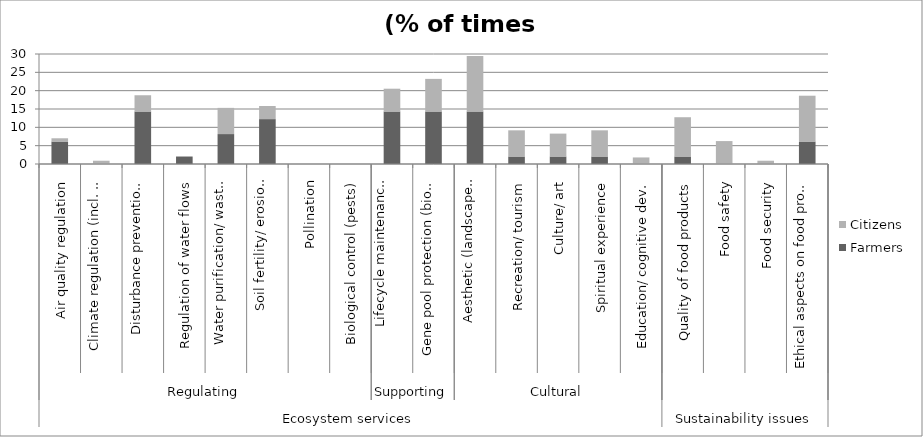
| Category | Farmers | Citizens |
|---|---|---|
| 0 | 6.122 | 0.893 |
| 1 | 0 | 0.893 |
| 2 | 14.286 | 4.464 |
| 3 | 2.041 | 0 |
| 4 | 8.163 | 7.143 |
| 5 | 12.245 | 3.571 |
| 6 | 0 | 0 |
| 7 | 0 | 0 |
| 8 | 14.286 | 6.25 |
| 9 | 14.286 | 8.929 |
| 10 | 14.286 | 15.179 |
| 11 | 2.041 | 7.143 |
| 12 | 2.041 | 6.25 |
| 13 | 2.041 | 7.143 |
| 14 | 0 | 1.786 |
| 15 | 2.041 | 10.714 |
| 16 | 0 | 6.25 |
| 17 | 0 | 0.893 |
| 18 | 6.122 | 12.5 |